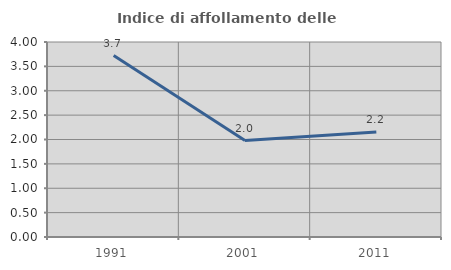
| Category | Indice di affollamento delle abitazioni  |
|---|---|
| 1991.0 | 3.723 |
| 2001.0 | 1.979 |
| 2011.0 | 2.155 |